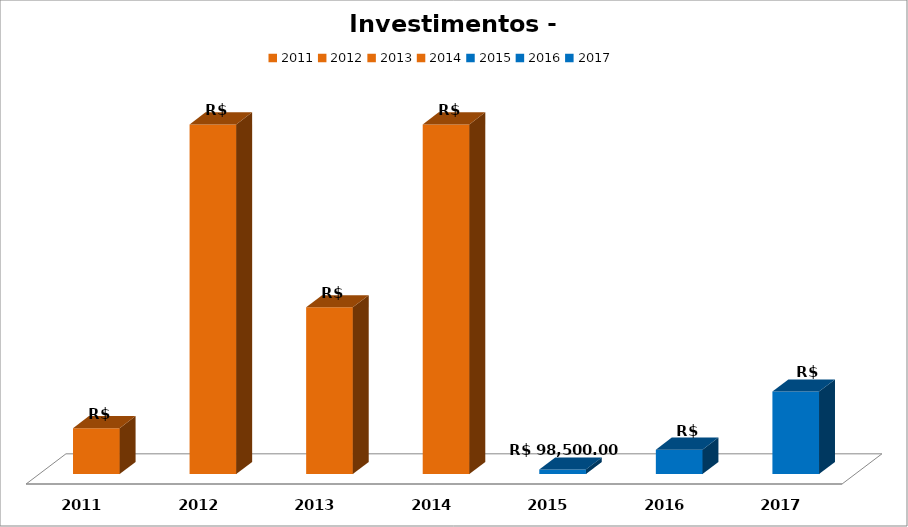
| Category | Series 1 |
|---|---|
| 2011.0 | 985072 |
| 2012.0 | 7502065 |
| 2013.0 | 3576731 |
| 2014.0 | 7501779.25 |
| 2015.0 | 98500 |
| 2016.0 | 522414.66 |
| 2017.0 | 1771590.75 |